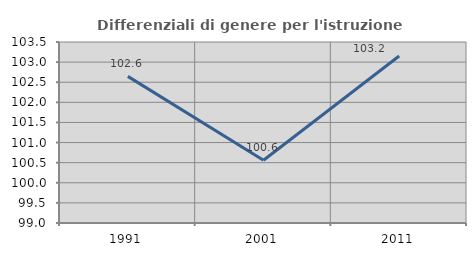
| Category | Differenziali di genere per l'istruzione superiore |
|---|---|
| 1991.0 | 102.645 |
| 2001.0 | 100.559 |
| 2011.0 | 103.153 |